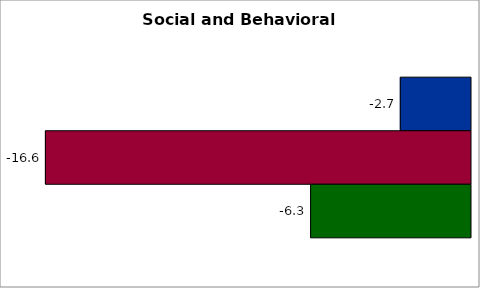
| Category | 50 states and D.C. | SREB states | State |
|---|---|---|---|
| 0 | -2.747 | -16.634 | -6.256 |